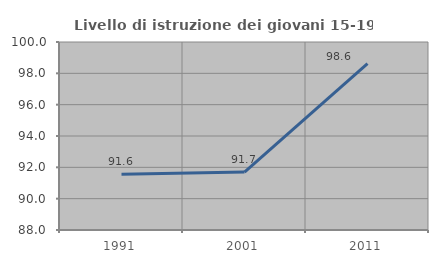
| Category | Livello di istruzione dei giovani 15-19 anni |
|---|---|
| 1991.0 | 91.553 |
| 2001.0 | 91.694 |
| 2011.0 | 98.625 |